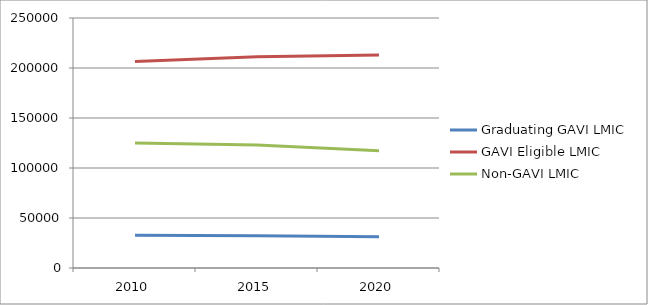
| Category | Graduating GAVI LMIC | GAVI Eligible LMIC | Non-GAVI LMIC |
|---|---|---|---|
| 2010.0 | 32837 | 206558 | 124931 |
| 2015.0 | 32304 | 211147 | 122978 |
| 2020.0 | 31336 | 213063 | 117253 |